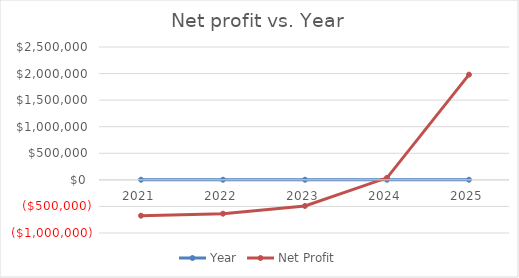
| Category | Year | Net Profit |
|---|---|---|
| 2021.0 | 2021 | -674333.333 |
| 2022.0 | 2022 | -636645.333 |
| 2023.0 | 2023 | -490726.133 |
| 2024.0 | 2024 | 38225.997 |
| 2025.0 | 2025 | 1979893.172 |